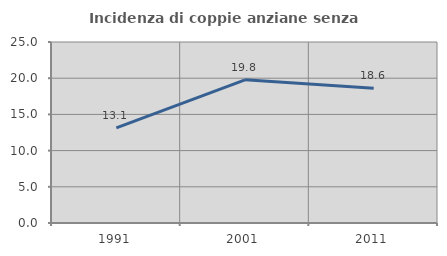
| Category | Incidenza di coppie anziane senza figli  |
|---|---|
| 1991.0 | 13.131 |
| 2001.0 | 19.774 |
| 2011.0 | 18.627 |